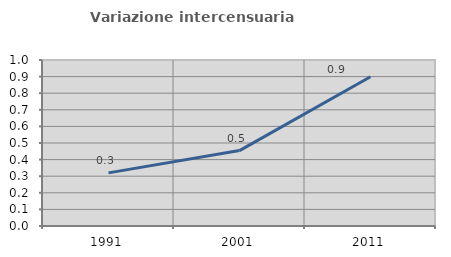
| Category | Variazione intercensuaria annua |
|---|---|
| 1991.0 | 0.32 |
| 2001.0 | 0.454 |
| 2011.0 | 0.899 |